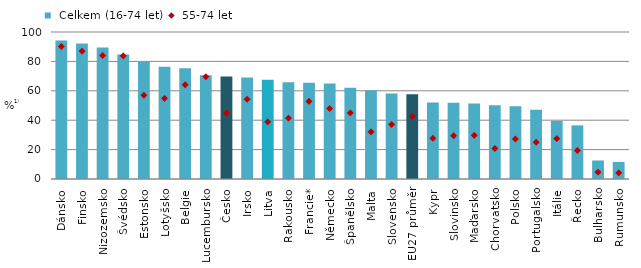
| Category |  Celkem (16-74 let) |
|---|---|
| Dánsko | 94.3 |
| Finsko | 92.2 |
| Nizozemsko | 89.4 |
| Švédsko | 84.7 |
| Estonsko | 79.8 |
| Lotyšsko | 76.4 |
| Belgie | 75.3 |
| Lucembursko | 70.6 |
| Česko | 69.7 |
| Irsko | 69 |
| Litva | 67.6 |
| Rakousko | 65.8 |
| Francie* | 65.546 |
| Německo | 64.9 |
| Španělsko | 62.1 |
| Malta | 60.3 |
| Slovensko | 58.2 |
| EU27 průměr | 57.687 |
| Kypr | 52.1 |
| Slovinsko | 51.8 |
| Maďarsko | 51.3 |
| Chorvatsko | 50.2 |
| Polsko | 49.5 |
| Portugalsko | 47.1 |
| Itálie | 39.452 |
| Řecko | 36.5 |
| Bulharsko | 12.6 |
| Rumunsko | 11.6 |